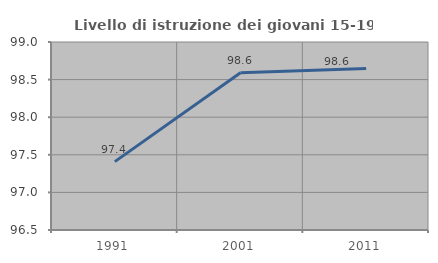
| Category | Livello di istruzione dei giovani 15-19 anni |
|---|---|
| 1991.0 | 97.409 |
| 2001.0 | 98.592 |
| 2011.0 | 98.649 |